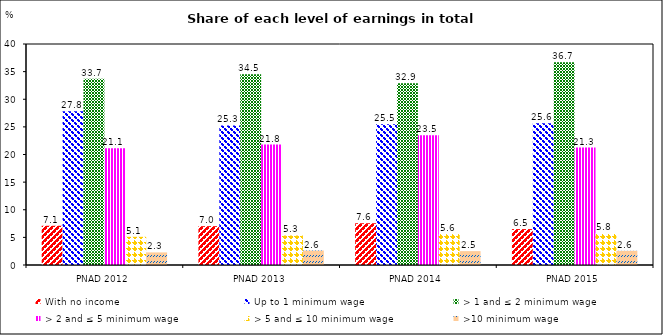
| Category |  With no income | Up to 1 minimum wage | > 1 and ≤ 2 minimum wage | > 2 and ≤ 5 minimum wage |  > 5 and ≤ 10 minimum wage | >10 minimum wage |
|---|---|---|---|---|---|---|
| PNAD 2012 | 7.1 | 27.82 | 33.71 | 21.13 | 5.1 | 2.28 |
| PNAD 2013 | 7.03 | 25.27 | 34.54 | 21.8 | 5.34 | 2.62 |
| PNAD 2014 | 7.56 | 25.47 | 32.91 | 23.48 | 5.59 | 2.51 |
| PNAD 2015 | 6.5 | 25.64 | 36.7 | 21.25 | 5.76 | 2.57 |